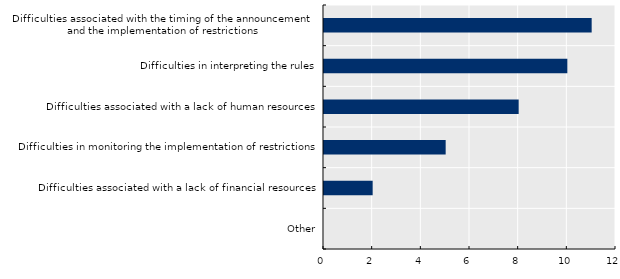
| Category | Occurrences |
|---|---|
| Other | 0 |
| Difficulties associated with a lack of financial resources | 2 |
| Difficulties in monitoring the implementation of restrictions | 5 |
| Difficulties associated with a lack of human resources | 8 |
| Difficulties in interpreting the rules | 10 |
| Difficulties associated with the timing of the announcement 
and the implementation of restrictions | 11 |